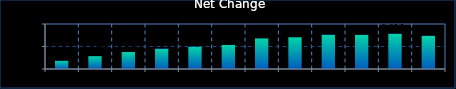
| Category | Series 0 |
|---|---|
| 0 | 0.004 |
| 1 | 0.006 |
| 2 | 0.008 |
| 3 | 0.009 |
| 4 | 0.01 |
| 5 | 0.011 |
| 6 | 0.014 |
| 7 | 0.014 |
| 8 | 0.015 |
| 9 | 0.015 |
| 10 | 0.016 |
| 11 | 0.015 |